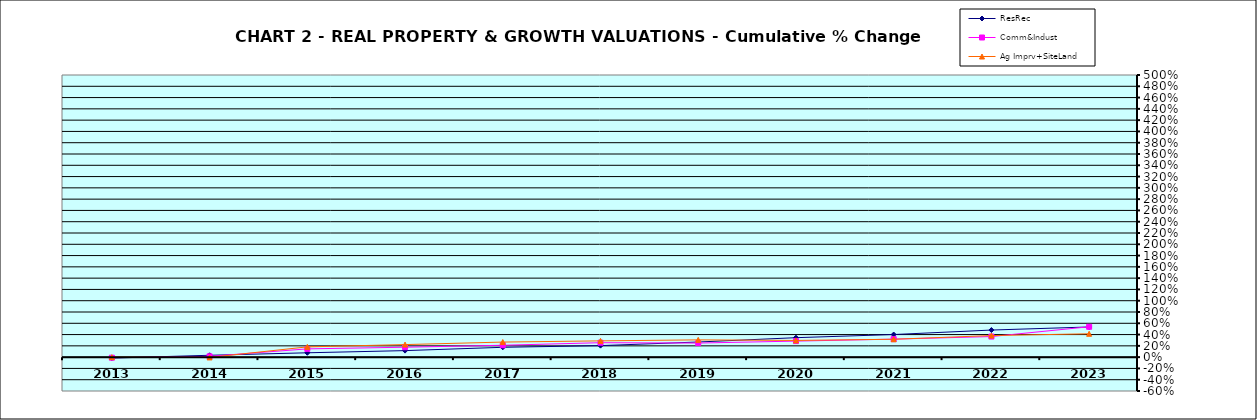
| Category | ResRec | Comm&Indust | Ag Imprv+SiteLand |
|---|---|---|---|
| 2013.0 | -0.017 | -0.009 | 0 |
| 2014.0 | 0.033 | 0.014 | -0.005 |
| 2015.0 | 0.077 | 0.147 | 0.182 |
| 2016.0 | 0.116 | 0.176 | 0.223 |
| 2017.0 | 0.174 | 0.211 | 0.267 |
| 2018.0 | 0.204 | 0.256 | 0.288 |
| 2019.0 | 0.268 | 0.25 | 0.306 |
| 2020.0 | 0.345 | 0.284 | 0.296 |
| 2021.0 | 0.401 | 0.319 | 0.317 |
| 2022.0 | 0.48 | 0.365 | 0.383 |
| 2023.0 | 0.535 | 0.538 | 0.414 |